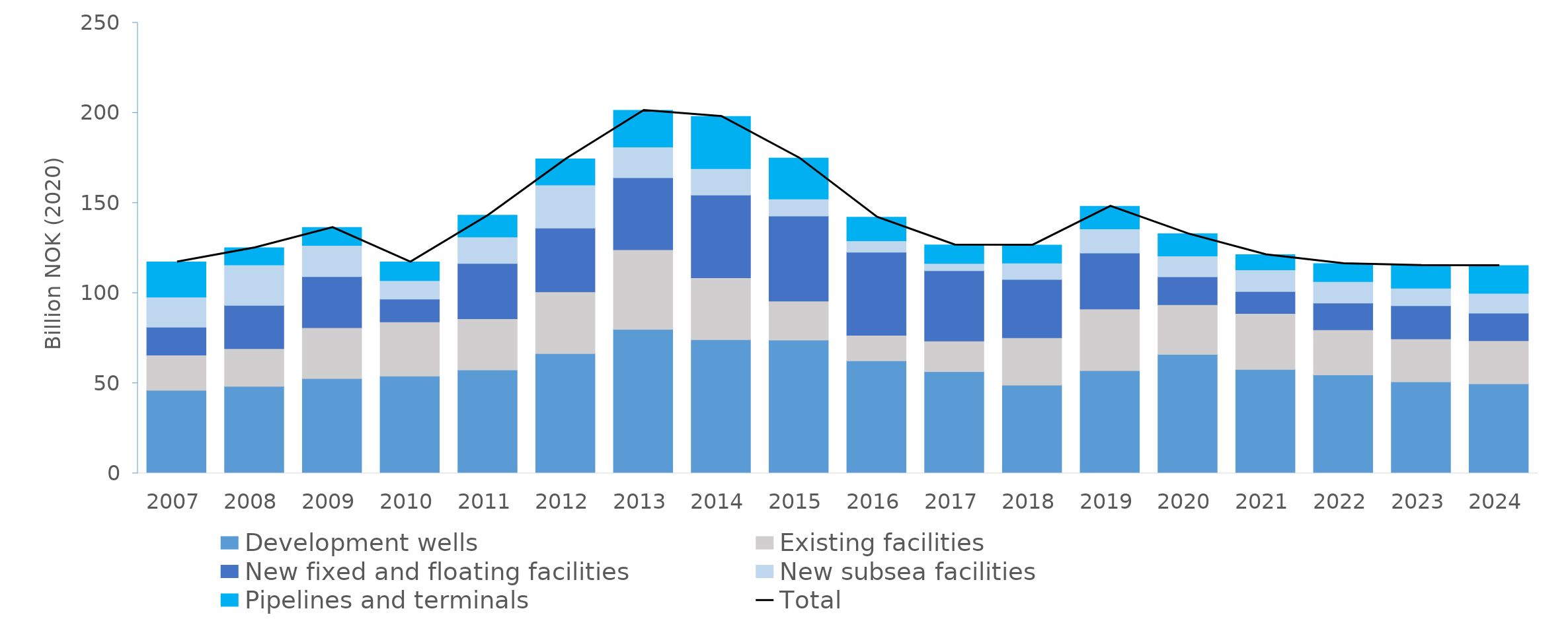
| Category | Development wells | Existing facilities | New fixed and floating facilities | New subsea facilities | Pipelines and terminals |
|---|---|---|---|---|---|
| 2007.0 | 46.13 | 19.471 | 15.525 | 16.638 | 19.559 |
| 2008.0 | 48.31 | 20.898 | 23.966 | 22.487 | 9.494 |
| 2009.0 | 52.64 | 28.188 | 28.308 | 17.311 | 9.984 |
| 2010.0 | 53.95 | 30.049 | 12.714 | 10.267 | 10.316 |
| 2011.0 | 57.376 | 28.423 | 30.708 | 14.655 | 12.093 |
| 2012.0 | 66.428 | 34.277 | 35.393 | 23.87 | 14.515 |
| 2013.0 | 79.923 | 44.155 | 39.948 | 17.071 | 20.32 |
| 2014.0 | 74.174 | 34.287 | 45.978 | 14.664 | 28.98 |
| 2015.0 | 73.993 | 21.559 | 47.223 | 9.402 | 22.8 |
| 2016.0 | 62.405 | 14.166 | 46.144 | 6.344 | 13.115 |
| 2017.0 | 56.459 | 16.981 | 39.017 | 4.014 | 10.286 |
| 2018.0 | 48.972 | 26.246 | 32.336 | 9.072 | 10.06 |
| 2019.0 | 56.991 | 34.173 | 31.078 | 13.403 | 12.581 |
| 2020.0 | 66.002 | 27.608 | 15.481 | 11.556 | 12.292 |
| 2021.0 | 57.615 | 31.087 | 12.162 | 12.048 | 8.438 |
| 2022.0 | 54.597 | 25.057 | 14.828 | 11.908 | 10.036 |
| 2023.0 | 50.784 | 23.839 | 18.387 | 9.691 | 12.69 |
| 2024.0 | 49.646 | 23.965 | 15.308 | 10.963 | 15.446 |